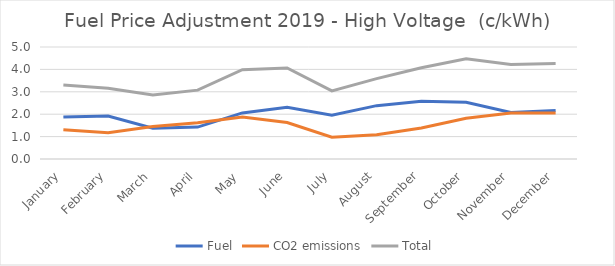
| Category | Fuel | CO2 emissions | Total |
|---|---|---|---|
| January | 1.878 | 1.303 | 3.301 |
| February | 1.92 | 1.173 | 3.161 |
| March | 1.372 | 1.452 | 2.856 |
| April | 1.425 | 1.614 | 3.074 |
| May | 2.056 | 1.875 | 3.985 |
| June | 2.314 | 1.629 | 4.066 |
| July | 1.957 | 0.969 | 3.043 |
| August | 2.382 | 1.084 | 3.586 |
| September | 2.574 | 1.383 | 4.074 |
| October | 2.529 | 1.817 | 4.478 |
| November | 2.078 | 2.052 | 4.216 |
| December | 2.164 | 2.053 | 4.259 |